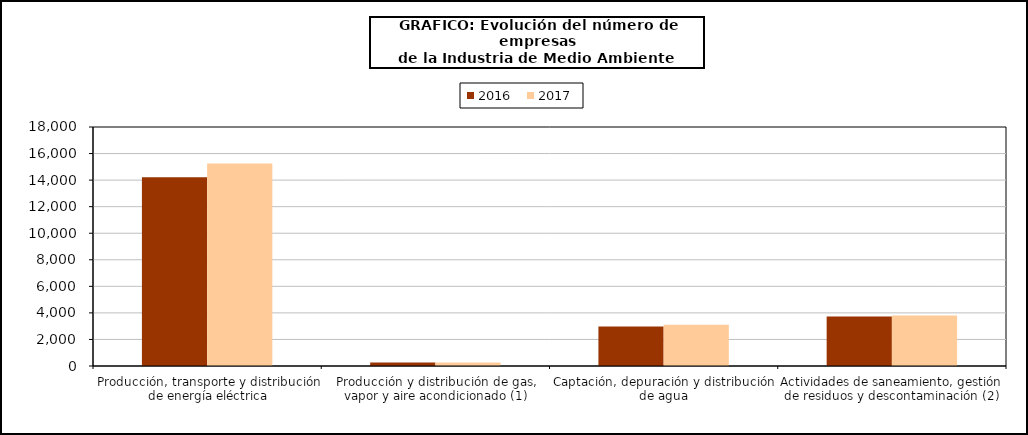
| Category | 2016 | 2017 |
|---|---|---|
| Producción, transporte y distribución de energía eléctrica | 14211 | 15242 |
| Producción y distribución de gas, vapor y aire acondicionado (1) | 264 | 269 |
| Captación, depuración y distribución de agua | 2978 | 3110 |
| Actividades de saneamiento, gestión de residuos y descontaminación (2) | 3732 | 3812 |